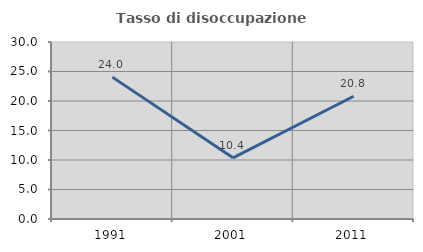
| Category | Tasso di disoccupazione giovanile  |
|---|---|
| 1991.0 | 24.047 |
| 2001.0 | 10.363 |
| 2011.0 | 20.809 |